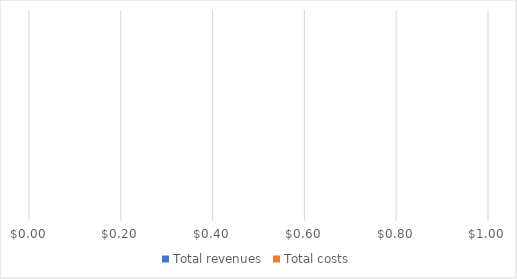
| Category | Total revenues | Total costs |
|---|---|---|
| 0 | 0 | 0 |